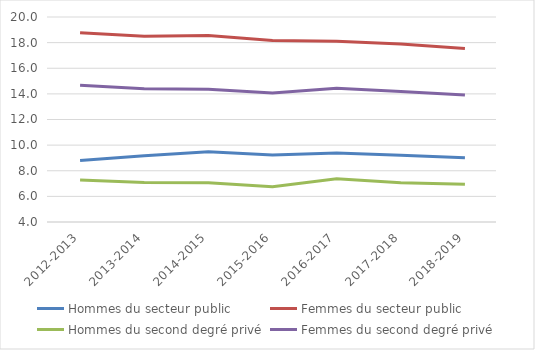
| Category | Hommes du secteur public | Femmes du secteur public | Hommes du second degré privé | Femmes du second degré privé |
|---|---|---|---|---|
| 2012-2013 | 8.8 | 18.78 | 7.27 | 14.68 |
| 2013-2014 | 9.17 | 18.5 | 7.09 | 14.4 |
| 2014-2015 | 9.49 | 18.56 | 7.06 | 14.37 |
| 2015-2016 | 9.23 | 18.17 | 6.75 | 14.06 |
| 2016-2017 | 9.39 | 18.1 | 7.37 | 14.43 |
| 2017-2018 | 9.21 | 17.89 | 7.07 | 14.18 |
| 2018-2019 | 9.01 | 17.55 | 6.94 | 13.91 |